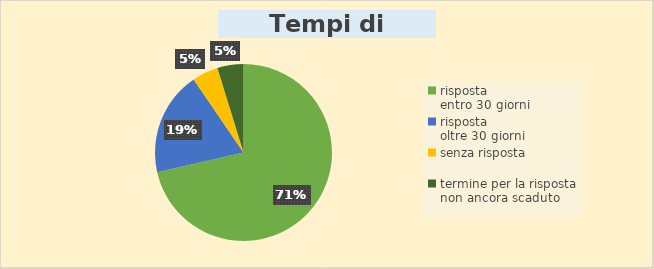
| Category | Series 0 |
|---|---|
| risposta
entro 30 giorni | 15 |
| risposta
oltre 30 giorni | 4 |
| senza risposta | 1 |
| termine per la risposta non ancora scaduto | 1 |